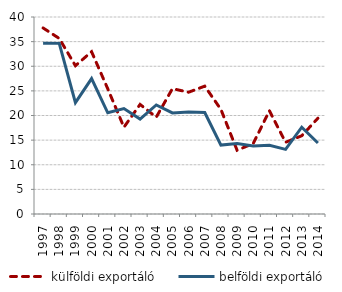
| Category | külföldi exportáló | belföldi exportáló |
|---|---|---|
| 1997.0 | 37.778 | 34.691 |
| 1998.0 | 35.646 | 34.648 |
| 1999.0 | 30.106 | 22.621 |
| 2000.0 | 32.952 | 27.5 |
| 2001.0 | 25.427 | 20.547 |
| 2002.0 | 17.621 | 21.406 |
| 2003.0 | 22.246 | 19.265 |
| 2004.0 | 19.656 | 22.148 |
| 2005.0 | 25.451 | 20.519 |
| 2006.0 | 24.727 | 20.721 |
| 2007.0 | 25.962 | 20.603 |
| 2008.0 | 21.232 | 14 |
| 2009.0 | 12.948 | 14.297 |
| 2010.0 | 14.317 | 13.806 |
| 2011.0 | 20.958 | 13.946 |
| 2012.0 | 14.563 | 13.127 |
| 2013.0 | 15.888 | 17.628 |
| 2014.0 | 19.455 | 14.421 |